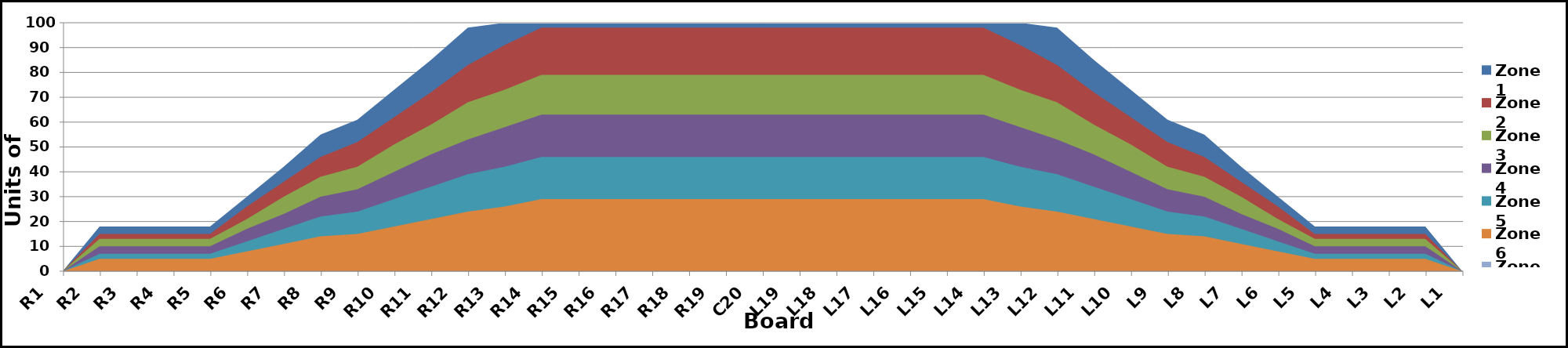
| Category | Zone 1 | Zone 2 | Zone 3 | Zone 4 | Zone 5 | Zone 6 | Zone 7 | Zone 8 |
|---|---|---|---|---|---|---|---|---|
| L1 | 0 | 0 | 0 | 0 | 0 | 0 | 0 | 0 |
| L2 | 18 | 15 | 13 | 10 | 7 | 5 | 0 | 0 |
| L3 | 18 | 15 | 13 | 10 | 7 | 5 | 0 | 0 |
| L4 | 18 | 15 | 13 | 10 | 7 | 5 | 0 | 0 |
| L5 | 18 | 15 | 13 | 10 | 7 | 5 | 0 | 0 |
| L6 | 30 | 26 | 21 | 17 | 12 | 8 | 0 | 0 |
| L7 | 42 | 36 | 30 | 23 | 17 | 11 | 0 | 0 |
| L8 | 55 | 46 | 38 | 30 | 22 | 14 | 0 | 0 |
| L9 | 61 | 52 | 42 | 33 | 24 | 15 | 0 | 0 |
| L10 | 73 | 62 | 51 | 40 | 29 | 18 | 0 | 0 |
| L11 | 85 | 72 | 59 | 47 | 34 | 21 | 0 | 0 |
| L12 | 98 | 83 | 68 | 53 | 39 | 24 | 0 | 0 |
| L13 | 100 | 91 | 73 | 58 | 42 | 26 | 0 | 0 |
| L14 | 100 | 98 | 79 | 63 | 46 | 29 | 0 | 0 |
| L15 | 100 | 98 | 79 | 63 | 46 | 29 | 0 | 0 |
| L16 | 100 | 98 | 79 | 63 | 46 | 29 | 0 | 0 |
| L17 | 100 | 98 | 79 | 63 | 46 | 29 | 0 | 0 |
| L18 | 100 | 98 | 79 | 63 | 46 | 29 | 0 | 0 |
| L19 | 100 | 98 | 79 | 63 | 46 | 29 | 0 | 0 |
| C20 | 100 | 98 | 79 | 63 | 46 | 29 | 0 | 0 |
| R19 | 100 | 98 | 79 | 63 | 46 | 29 | 0 | 0 |
| R18 | 100 | 98 | 79 | 63 | 46 | 29 | 0 | 0 |
| R17 | 100 | 98 | 79 | 63 | 46 | 29 | 0 | 0 |
| R16 | 100 | 98 | 79 | 63 | 46 | 29 | 0 | 0 |
| R15 | 100 | 98 | 79 | 63 | 46 | 29 | 0 | 0 |
| R14 | 100 | 98 | 79 | 63 | 46 | 29 | 0 | 0 |
| R13 | 100 | 91 | 73 | 58 | 42 | 26 | 0 | 0 |
| R12 | 98 | 83 | 68 | 53 | 39 | 24 | 0 | 0 |
| R11 | 85 | 72 | 59 | 47 | 34 | 21 | 0 | 0 |
| R10 | 73 | 62 | 51 | 40 | 29 | 18 | 0 | 0 |
| R9 | 61 | 52 | 42 | 33 | 24 | 15 | 0 | 0 |
| R8 | 55 | 46 | 38 | 30 | 22 | 14 | 0 | 0 |
| R7 | 42 | 36 | 30 | 23 | 17 | 11 | 0 | 0 |
| R6 | 30 | 26 | 21 | 17 | 12 | 8 | 0 | 0 |
| R5 | 18 | 15 | 13 | 10 | 7 | 5 | 0 | 0 |
| R4 | 18 | 15 | 13 | 10 | 7 | 5 | 0 | 0 |
| R3 | 18 | 15 | 13 | 10 | 7 | 5 | 0 | 0 |
| R2 | 18 | 15 | 13 | 10 | 7 | 5 | 0 | 0 |
| R1 | 0 | 0 | 0 | 0 | 0 | 0 | 0 | 0 |